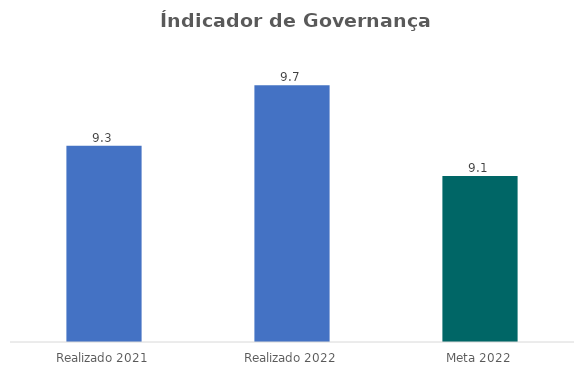
| Category | Series 0 |
|---|---|
| Realizado 2021 | 9.3 |
| Realizado 2022 | 9.7 |
| Meta 2022 | 9.1 |